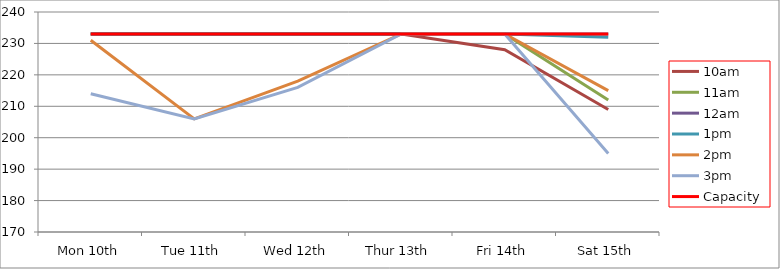
| Category | 9am | 10am | 11am | 12am | 1pm | 2pm | 3pm | 4pm | 5pm | Capacity |
|---|---|---|---|---|---|---|---|---|---|---|
| Mon 10th |  | 233 | 233 | 233 | 233 | 231 | 214 |  |  | 233 |
| Tue 11th |  | 233 | 233 | 233 | 233 | 206 | 206 |  |  | 233 |
| Wed 12th |  | 233 | 233 | 233 | 233 | 218 | 216 |  |  | 233 |
| Thur 13th |  | 233 | 233 | 233 | 233 | 233 | 233 |  |  | 233 |
| Fri 14th |  | 228 | 233 | 233 | 233 | 233 | 233 |  |  | 233 |
| Sat 15th |  | 209 | 212 | 233 | 232 | 215 | 195 |  |  | 233 |